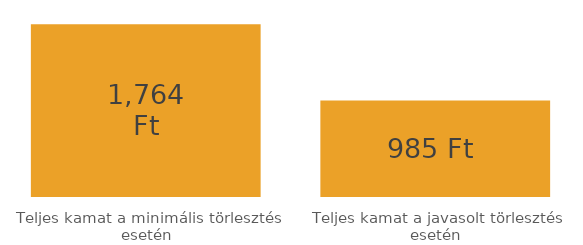
| Category | Series 0 |
|---|---|
| Teljes kamat a minimális törlesztés esetén | 1763.952 |
| Teljes kamat a javasolt törlesztés esetén | 984.811 |